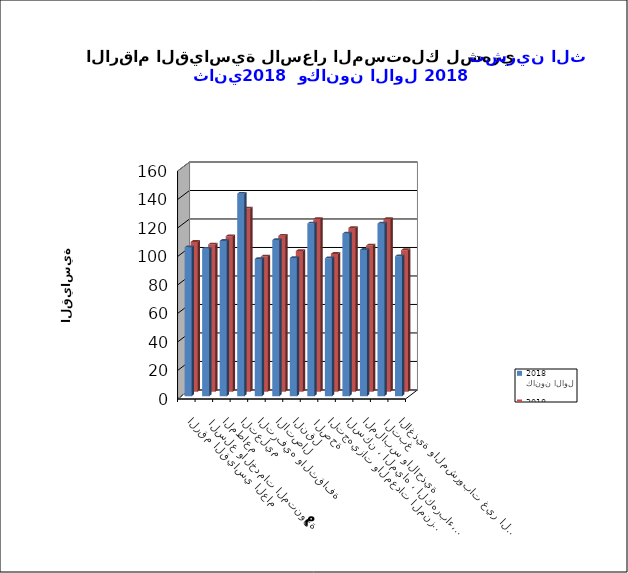
| Category | كانون الاول 2018      | تشرين الثاني 2018      |
|---|---|---|
| الاغذية والمشروبات غير الكحولية | 98.2 | 99.3 |
|  التبغ | 121.1 | 121.1 |
| الملابس والاحذية | 102.7 | 102.5 |
| السكن ، المياه ، الكهرباء، الغاز  | 114.1 | 114.9 |
| التجهيزات والمعدات المنزلية والصيانة | 96.8 | 96.7 |
|  الصحة | 121.2 | 121.2 |
| النقل | 97 | 98.7 |
| الاتصال | 109.6 | 109.4 |
| الترفيه والثقافة | 96.3 | 94.8 |
| التعليم | 142.1 | 128.5 |
| المطاعم  | 109 | 109.1 |
|  السلع والخدمات المتنوعة | 103.5 | 103.3 |
| الرقم القياسي العام | 104.5 | 105.1 |